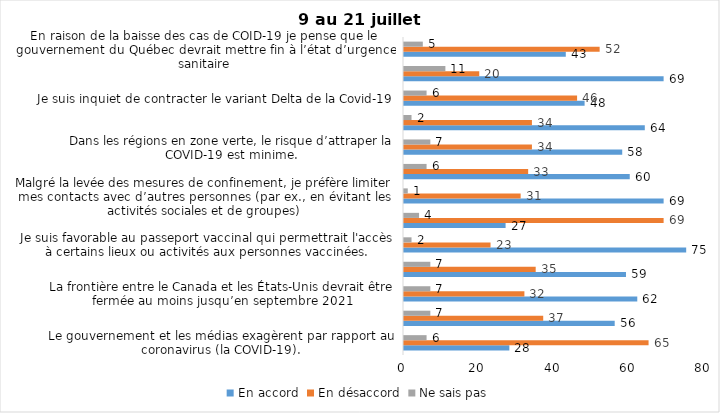
| Category | En accord | En désaccord | Ne sais pas |
|---|---|---|---|
| Le gouvernement et les médias exagèrent par rapport au coronavirus (la COVID-19). | 28 | 65 | 6 |
| J’ai peur que le système de santé soit débordé par les cas de COVID-19 suite au "déconfinement" | 56 | 37 | 7 |
| La frontière entre le Canada et les États-Unis devrait être fermée au moins jusqu’en septembre 2021 | 62 | 32 | 7 |
| Les personnes vaccinées contre la COVID-19 devraient avoir le droit de faire des rassemblements privés et de ne plus porter le masque dans les lieux publics. | 59 | 35 | 7 |
| Je suis favorable au passeport vaccinal qui permettrait l'accès à certains lieux ou activités aux personnes vaccinées. | 75 | 23 | 2 |
| Étant donné la progression de la vaccination et la diminution du nombre de cas de COVID-19, je pense qu’il est moins important de suivre les mesures de prévention. | 27 | 69 | 4 |
| Malgré la levée des mesures de confinement, je préfère limiter mes contacts avec d’autres personnes (par ex., en évitant les activités sociales et de groupes) | 69 | 31 | 1 |
| J’ai peur qu’il y ait une 4e vague de la COVID-19. | 60 | 33 | 6 |
| Dans les régions en zone verte, le risque d’attraper la COVID-19 est minime. | 58 | 34 | 7 |
| Si les cas de COVID-19 augmentent cet automne, je suis favorable à la mise en place de mesures de confinement (ex. fermeture de services non essentiels, interdiction des rassemblements privés) | 64 | 34 | 2 |
| Je suis inquiet de contracter le variant Delta de la Covid-19 | 48 | 46 | 6 |
| Je suis confiant que la vaccination protège efficacement contre les variants de la COVID-19 | 69 | 20 | 11 |
| En raison de la baisse des cas de COID-19 je pense que le gouvernement du Québec devrait mettre fin à l’état d’urgence sanitaire | 43 | 52 | 5 |